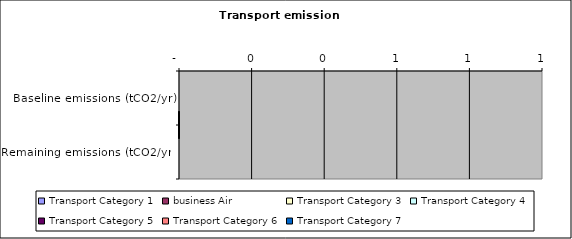
| Category |  Transport Category 1  |  business Air  |  Transport Category 3  |  Transport Category 4  |  Transport Category 5  |  Transport Category 6  |  Transport Category 7  |
|---|---|---|---|---|---|---|---|
| Baseline emissions (tCO2/yr) | 0 | 0 | 0 | 0 | 0 | 0 | 0 |
| Remaining emissions (tCO2/yr) | 0 | 0 | 0 | 0 | 0 | 0 | 0 |